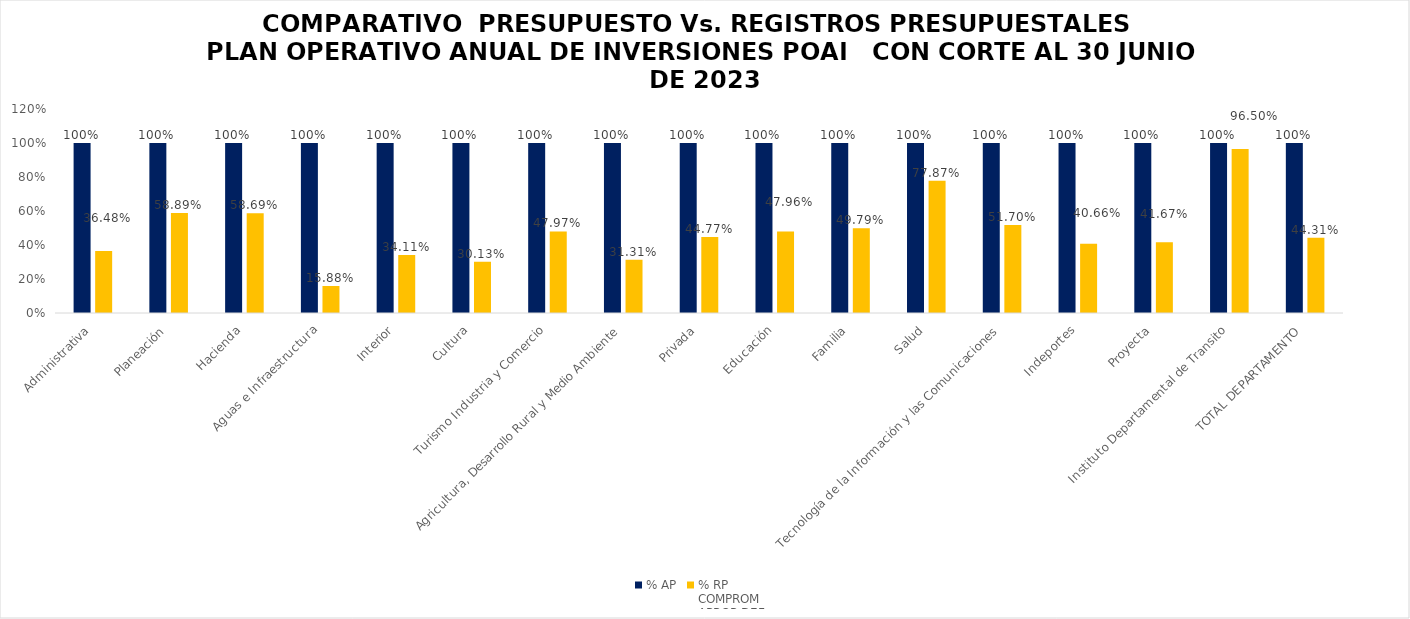
| Category | % AP | % RP
COMPROM
APROP DEF |
|---|---|---|
| Administrativa | 1 | 0.365 |
| Planeación | 1 | 0.589 |
| Hacienda | 1 | 0.587 |
| Aguas e Infraestructura | 1 | 0.159 |
| Interior | 1 | 0.341 |
| Cultura | 1 | 0.301 |
| Turismo Industria y Comercio | 1 | 0.48 |
| Agricultura, Desarrollo Rural y Medio Ambiente | 1 | 0.313 |
| Privada | 1 | 0.448 |
| Educación | 1 | 0.48 |
| Familia | 1 | 0.498 |
| Salud | 1 | 0.779 |
| Tecnología de la Información y las Comunicaciones | 1 | 0.517 |
| Indeportes | 1 | 0.407 |
| Proyecta | 1 | 0.417 |
| Instituto Departamental de Transito | 1 | 0.965 |
| TOTAL DEPARTAMENTO | 1 | 0.443 |